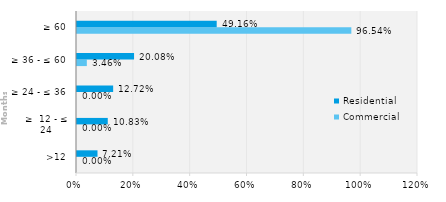
| Category | Commercial | Residential |
|---|---|---|
| >12 | 0 | 0.072 |
| ≥  12 - ≤ 24 | 0 | 0.108 |
| ≥ 24 - ≤ 36 | 0 | 0.127 |
| ≥ 36 - ≤ 60 | 0.035 | 0.201 |
| ≥ 60 | 0.965 | 0.492 |